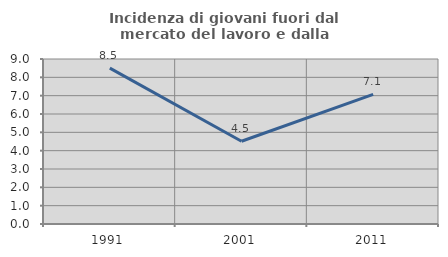
| Category | Incidenza di giovani fuori dal mercato del lavoro e dalla formazione  |
|---|---|
| 1991.0 | 8.502 |
| 2001.0 | 4.514 |
| 2011.0 | 7.069 |